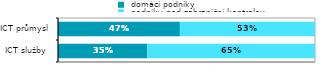
| Category |  domácí podniky |  podniky pod zahraniční kontrolou |
|---|---|---|
| ICT služby  | 0.347 | 0.653 |
| ICT průmysl | 0.474 | 0.526 |